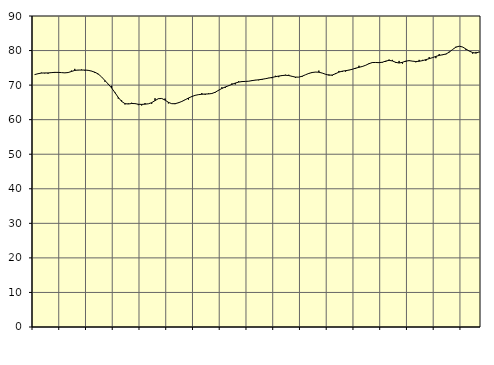
| Category | Piggar | Series 1 |
|---|---|---|
| nan | 73 | 73.04 |
| 87.0 | 73.3 | 73.3 |
| 87.0 | 73.6 | 73.48 |
| 87.0 | 73.4 | 73.52 |
| nan | 73.3 | 73.52 |
| 88.0 | 73.7 | 73.61 |
| 88.0 | 73.5 | 73.69 |
| 88.0 | 73.6 | 73.68 |
| nan | 73.6 | 73.62 |
| 89.0 | 73.5 | 73.55 |
| 89.0 | 73.6 | 73.64 |
| 89.0 | 74.2 | 73.94 |
| nan | 74.7 | 74.25 |
| 90.0 | 74.3 | 74.36 |
| 90.0 | 74.5 | 74.35 |
| 90.0 | 74.2 | 74.36 |
| nan | 74.2 | 74.28 |
| 91.0 | 74.1 | 74.06 |
| 91.0 | 73.5 | 73.73 |
| 91.0 | 73.1 | 73.23 |
| nan | 72.4 | 72.38 |
| 92.0 | 71 | 71.33 |
| 92.0 | 70.2 | 70.31 |
| 92.0 | 69.8 | 69.18 |
| nan | 67.7 | 67.85 |
| 93.0 | 66.1 | 66.44 |
| 93.0 | 65.6 | 65.29 |
| 93.0 | 64.4 | 64.64 |
| nan | 64.7 | 64.53 |
| 94.0 | 64.9 | 64.68 |
| 94.0 | 64.6 | 64.65 |
| 94.0 | 64.2 | 64.46 |
| nan | 64.1 | 64.42 |
| 95.0 | 64.8 | 64.49 |
| 95.0 | 64.6 | 64.59 |
| 95.0 | 64.6 | 64.92 |
| nan | 66.2 | 65.52 |
| 96.0 | 66 | 66.07 |
| 96.0 | 66.1 | 66.13 |
| 96.0 | 66.1 | 65.66 |
| nan | 64.7 | 65.02 |
| 97.0 | 64.6 | 64.62 |
| 97.0 | 64.5 | 64.62 |
| 97.0 | 65 | 64.89 |
| nan | 65.2 | 65.27 |
| 98.0 | 65.8 | 65.75 |
| 98.0 | 65.8 | 66.26 |
| 98.0 | 66.8 | 66.69 |
| nan | 67 | 67.04 |
| 99.0 | 67.2 | 67.24 |
| 99.0 | 67.7 | 67.35 |
| 99.0 | 67.2 | 67.42 |
| nan | 67.6 | 67.45 |
| 0.0 | 67.5 | 67.57 |
| 0.0 | 67.8 | 67.93 |
| 0.0 | 68.4 | 68.51 |
| nan | 69.4 | 69.03 |
| 1.0 | 69.2 | 69.46 |
| 1.0 | 69.9 | 69.82 |
| 1.0 | 70.5 | 70.21 |
| nan | 70.2 | 70.59 |
| 2.0 | 71.1 | 70.87 |
| 2.0 | 70.9 | 71.02 |
| 2.0 | 71.1 | 71.07 |
| nan | 71.1 | 71.13 |
| 3.0 | 71.4 | 71.3 |
| 3.0 | 71.5 | 71.44 |
| 3.0 | 71.4 | 71.54 |
| nan | 71.5 | 71.68 |
| 4.0 | 71.8 | 71.85 |
| 4.0 | 72.1 | 72.04 |
| 4.0 | 72 | 72.22 |
| nan | 72.7 | 72.43 |
| 5.0 | 72.3 | 72.62 |
| 5.0 | 72.9 | 72.76 |
| 5.0 | 73 | 72.85 |
| nan | 73 | 72.77 |
| 6.0 | 72.5 | 72.54 |
| 6.0 | 72.1 | 72.32 |
| 6.0 | 72.3 | 72.31 |
| nan | 72.4 | 72.57 |
| 7.0 | 73 | 72.99 |
| 7.0 | 73.5 | 73.38 |
| 7.0 | 73.5 | 73.65 |
| nan | 73.8 | 73.77 |
| 8.0 | 74.2 | 73.73 |
| 8.0 | 73.5 | 73.49 |
| 8.0 | 73.1 | 73.14 |
| nan | 73.1 | 72.87 |
| 9.0 | 72.7 | 72.92 |
| 9.0 | 73.5 | 73.3 |
| 9.0 | 74.1 | 73.76 |
| nan | 73.8 | 74.03 |
| 10.0 | 73.9 | 74.18 |
| 10.0 | 74.4 | 74.34 |
| 10.0 | 74.5 | 74.59 |
| nan | 74.7 | 74.9 |
| 11.0 | 75.6 | 75.15 |
| 11.0 | 75.3 | 75.39 |
| 11.0 | 75.7 | 75.74 |
| nan | 76.1 | 76.21 |
| 12.0 | 76.4 | 76.53 |
| 12.0 | 76.5 | 76.55 |
| 12.0 | 76.4 | 76.5 |
| nan | 76.5 | 76.62 |
| 13.0 | 76.7 | 76.95 |
| 13.0 | 77.4 | 77.17 |
| 13.0 | 77.3 | 77 |
| nan | 76.4 | 76.59 |
| 14.0 | 77 | 76.39 |
| 14.0 | 76.2 | 76.6 |
| 14.0 | 76.7 | 76.95 |
| nan | 77.2 | 77.08 |
| 15.0 | 76.9 | 76.94 |
| 15.0 | 76.6 | 76.82 |
| 15.0 | 77.3 | 76.9 |
| nan | 77.3 | 77.09 |
| 16.0 | 77 | 77.37 |
| 16.0 | 78.1 | 77.65 |
| 16.0 | 77.9 | 77.95 |
| nan | 77.8 | 78.31 |
| 17.0 | 79 | 78.6 |
| 17.0 | 78.7 | 78.78 |
| 17.0 | 78.9 | 79 |
| nan | 79.7 | 79.53 |
| 18.0 | 80.3 | 80.31 |
| 18.0 | 81.1 | 80.98 |
| 18.0 | 81.3 | 81.26 |
| nan | 81 | 81.03 |
| 19.0 | 80.2 | 80.44 |
| 19.0 | 79.8 | 79.84 |
| 19.0 | 79.1 | 79.43 |
| nan | 79.6 | 79.26 |
| 20.0 | 79.5 | 79.63 |